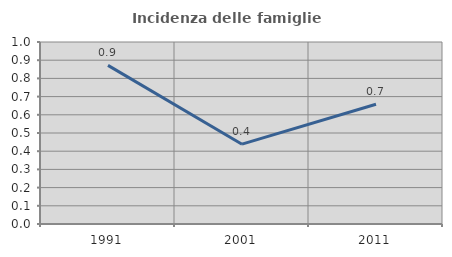
| Category | Incidenza delle famiglie numerose |
|---|---|
| 1991.0 | 0.871 |
| 2001.0 | 0.439 |
| 2011.0 | 0.658 |